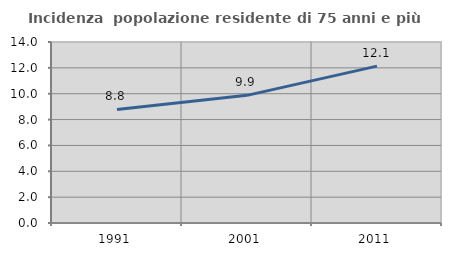
| Category | Incidenza  popolazione residente di 75 anni e più |
|---|---|
| 1991.0 | 8.779 |
| 2001.0 | 9.874 |
| 2011.0 | 12.132 |